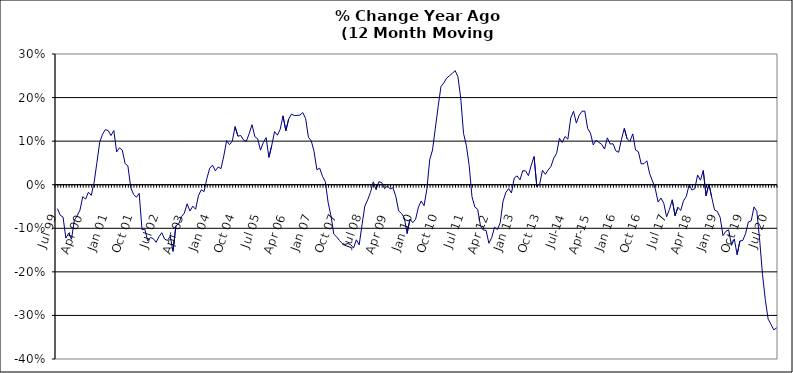
| Category | Series 0 |
|---|---|
| Jul 99 | -0.055 |
| Aug 99 | -0.07 |
| Sep 99 | -0.074 |
| Oct 99 | -0.123 |
| Nov 99 | -0.111 |
| Dec 99 | -0.125 |
| Jan 00 | -0.082 |
| Feb 00 | -0.071 |
| Mar 00 | -0.058 |
| Apr 00 | -0.027 |
| May 00 | -0.033 |
| Jun 00 | -0.017 |
| Jul 00 | -0.025 |
| Aug 00 | 0.005 |
| Sep 00 | 0.05 |
| Oct 00 | 0.098 |
| Nov 00 | 0.116 |
| Dec 00 | 0.127 |
| Jan 01 | 0.124 |
| Feb 01 | 0.113 |
| Mar 01 | 0.124 |
| Apr 01 | 0.075 |
| May 01 | 0.085 |
| Jun 01 | 0.08 |
| Jul 01 | 0.048 |
| Aug 01 | 0.043 |
| Sep 01 | -0.007 |
| Oct 01 | -0.022 |
| Nov 01 | -0.029 |
| Dec 01 | -0.02 |
| Jan 02 | -0.103 |
| Feb 02 | -0.102 |
| Mar 02 | -0.129 |
| Apr 02 | -0.121 |
| May 02 | -0.124 |
| Jun 02 | -0.132 |
| Jul 02 | -0.119 |
| Aug 02 | -0.11 |
| Sep 02 | -0.125 |
| Oct 02 | -0.128 |
| Nov 02 | -0.118 |
| Dec 02 | -0.153 |
| Jan 03 | -0.094 |
| Feb 03 | -0.09 |
| Mar 03 | -0.073 |
| Apr 03 | -0.065 |
| May 03 | -0.044 |
| Jun 03 | -0.06 |
| Jul 03 | -0.049 |
| Aug 03 | -0.056 |
| Sep 03 | -0.026 |
| Oct 03 | -0.012 |
| Nov 03 | -0.016 |
| Dec 03 | 0.014 |
| Jan 04 | 0.038 |
| Feb 04 | 0.045 |
| Mar 04 | 0.032 |
| Apr 04 | 0.041 |
| May 04 | 0.037 |
| Jun 04 | 0.066 |
| Jul 04 | 0.101 |
| Aug 04 | 0.092 |
| Sep 04 | 0.1 |
| Oct 04 | 0.133 |
| Nov 04 | 0.111 |
| Dec 04 | 0.113 |
| Jan 05 | 0.103 |
| Feb 05 | 0.1 |
| Mar 05 | 0.118 |
| Apr 05 | 0.138 |
| May 05 | 0.11 |
| Jun 05 | 0.106 |
| Jul 05 | 0.079 |
| Aug 05 | 0.097 |
| Sep 05 | 0.108 |
| Oct 05 | 0.063 |
| Nov 05 | 0.09 |
| Dec 05 | 0.122 |
| Jan 06 | 0.114 |
| Feb 06 | 0.127 |
| Mar 06 | 0.158 |
| Apr 06 | 0.124 |
| May 06 | 0.151 |
| Jun 06 | 0.162 |
| Jul 06 | 0.159 |
| Aug 06 | 0.159 |
| Sep 06 | 0.16 |
| Oct 06 | 0.166 |
| Nov 06 | 0.152 |
| Dec 06 | 0.109 |
| Jan 07 | 0.101 |
| Feb 07 | 0.076 |
| Mar 07 | 0.034 |
| Apr 07 | 0.038 |
| May 07 | 0.019 |
| Jun 07 | 0.007 |
| Jul 07 | -0.041 |
| Aug 07 | -0.071 |
| Sep 07 | -0.113 |
| Oct 07 | -0.12 |
| Nov 07 | -0.128 |
| Dec 07 | -0.135 |
| Jan 08 | -0.137 |
| Feb 08 | -0.135 |
| Mar 08 | -0.137 |
| Apr 08 | -0.145 |
| May 08 | -0.126 |
| Jun 08 | -0.138 |
| Jul 08 | -0.093 |
| Aug 08 | -0.049 |
| Sep-08 | -0.035 |
| Oct 08 | -0.018 |
| Nov 08 | 0.007 |
| Dec 08 | -0.011 |
| Jan 09 | 0.007 |
| Feb 09 | 0.005 |
| Mar 09 | -0.009 |
| Apr 09 | -0.003 |
| May 09 | -0.01 |
| Jun 09 | -0.007 |
| Jul 09 | -0.027 |
| Aug 09 | -0.06 |
| Sep 09 | -0.066 |
| Oct 09 | -0.076 |
| Nov 09 | -0.112 |
| Dec 09 | -0.079 |
| Jan 10 | -0.087 |
| Feb 10 | -0.079 |
| Mar 10 | -0.052 |
| Apr 10 | -0.037 |
| May 10 | -0.048 |
| Jun 10 | -0.01 |
| Jul 10 | 0.057 |
| Aug 10 | 0.08 |
| Sep 10 | 0.13 |
| Oct 10 | 0.179 |
| Nov 10 | 0.226 |
| Dec 10 | 0.233 |
| Jan 11 | 0.245 |
| Feb 11 | 0.25 |
| Mar 11 | 0.255 |
| Apr 11 | 0.262 |
| May 11 | 0.248 |
| Jun 11 | 0.199 |
| Jul 11 | 0.118 |
| Aug 11 | 0.09 |
| Sep 11 | 0.044 |
| Oct 11 | -0.028 |
| Nov 11 | -0.051 |
| Dec 11 | -0.056 |
| Jan 12 | -0.094 |
| Feb 12 | -0.104 |
| Mar 12 | -0.105 |
| Apr 12 | -0.134 |
| May 12 | -0.121 |
| Jun 12 | -0.098 |
| Jul 12 | -0.103 |
| Aug 12 | -0.087 |
| Sep 12 | -0.038 |
| Oct 12 | -0.018 |
| Nov 12 | -0.009 |
| Dec 12 | -0.019 |
| Jan 13 | 0.016 |
| Feb-13 | 0.02 |
| Mar-13 | 0.011 |
| Apr 13 | 0.032 |
| May 13 | 0.032 |
| Jun-13 | 0.021 |
| Jul 13 | 0.045 |
| Aug 13 | 0.065 |
| Sep 13 | -0.005 |
| Oct 13 | 0.002 |
| Nov 13 | 0.033 |
| Dec 13 | 0.024 |
| Jan 14 | 0.034 |
| Feb-14 | 0.042 |
| Mar 14 | 0.061 |
| Apr 14 | 0.072 |
| May 14 | 0.107 |
| Jun 14 | 0.097 |
| Jul-14 | 0.111 |
| Aug-14 | 0.105 |
| Sep 14 | 0.153 |
| Oct 14 | 0.169 |
| Nov 14 | 0.141 |
| Dec 14 | 0.159 |
| Jan 15 | 0.169 |
| Feb 15 | 0.169 |
| Mar 15 | 0.129 |
| Apr-15 | 0.118 |
| May 15 | 0.091 |
| Jun-15 | 0.102 |
| Jul 15 | 0.097 |
| Aug 15 | 0.092 |
| Sep 15 | 0.082 |
| Oct 15 | 0.108 |
| Nov 15 | 0.093 |
| Dec 15 | 0.094 |
| Jan 16 | 0.078 |
| Feb 16 | 0.075 |
| Mar 16 | 0.104 |
| Apr 16 | 0.129 |
| May 16 | 0.105 |
| Jun 16 | 0.1 |
| Jul 16 | 0.117 |
| Aug 16 | 0.08 |
| Sep 16 | 0.076 |
| Oct 16 | 0.048 |
| Nov 16 | 0.048 |
| Dec 16 | 0.055 |
| Jan 17 | 0.025 |
| Feb 17 | 0.009 |
| Mar 17 | -0.01 |
| Apr 17 | -0.04 |
| May 17 | -0.031 |
| Jun 17 | -0.042 |
| Jul 17 | -0.074 |
| Aug 17 | -0.057 |
| Sep 17 | -0.035 |
| Oct 17 | -0.071 |
| Nov 17 | -0.052 |
| Dec 17 | -0.059 |
| Jan 18 | -0.037 |
| Feb 18 | -0.027 |
| Mar 18 | 0 |
| Apr 18 | -0.012 |
| May 18 | -0.009 |
| Jun 18 | 0.022 |
| Jul 18 | 0.01 |
| Aug 18 | 0.033 |
| Sep 18 | -0.025 |
| Oct 18 | 0.002 |
| Nov 18 | -0.029 |
| Dec 18 | -0.058 |
| Jan 19 | -0.061 |
| Feb 19 | -0.075 |
| Mar 19 | -0.117 |
| Apr 19 | -0.107 |
| May 19 | -0.104 |
| Jun 19 | -0.139 |
| Jul 19 | -0.124 |
| Aug 19 | -0.16 |
| Sep 19 | -0.129 |
| Oct 19 | -0.128 |
| Nov 19 | -0.112 |
| Dec 19 | -0.085 |
| Jan 20 | -0.083 |
| Feb 20 | -0.051 |
| Mar 20 | -0.061 |
| Apr 20 | -0.127 |
| May 20 | -0.206 |
| Jun 20 | -0.264 |
| Jul 20 | -0.308 |
| Aug 20 | -0.32 |
| Sep 20 | -0.333 |
| Oct 20 | -0.329 |